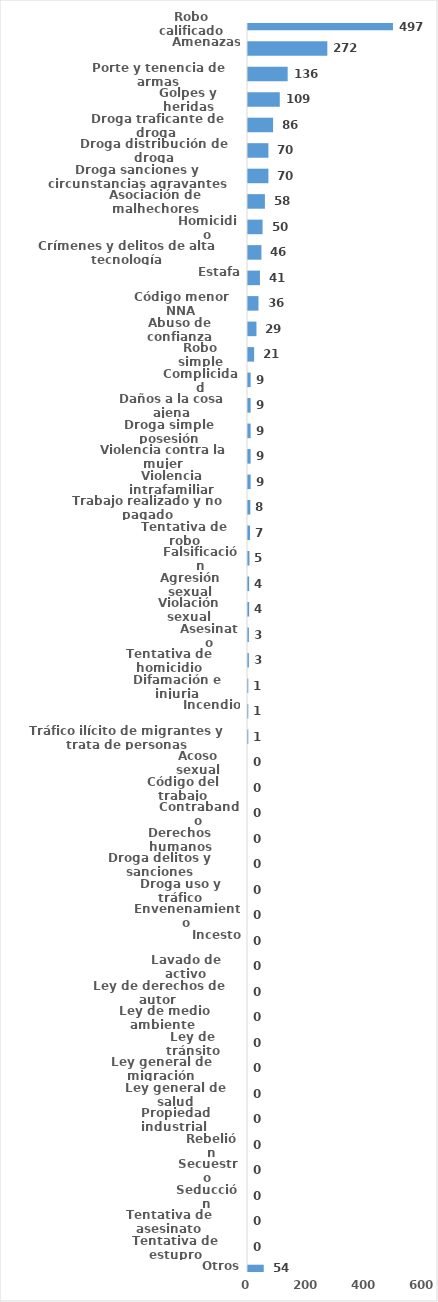
| Category | Series 0 |
|---|---|
| Robo calificado | 497 |
| Amenazas | 272 |
| Porte y tenencia de armas | 136 |
| Golpes y heridas | 109 |
| Droga traficante de droga  | 86 |
| Droga distribución de droga | 70 |
| Droga sanciones y circunstancias agravantes | 70 |
| Asociación de malhechores | 58 |
| Homicidio | 50 |
| Crímenes y delitos de alta tecnología | 46 |
| Estafa | 41 |
| Código menor NNA | 36 |
| Abuso de confianza | 29 |
| Robo simple | 21 |
| Complicidad | 9 |
| Daños a la cosa ajena | 9 |
| Droga simple posesión | 9 |
| Violencia contra la mujer | 9 |
| Violencia intrafamiliar | 9 |
| Trabajo realizado y no pagado | 8 |
| Tentativa de robo | 7 |
| Falsificación | 5 |
| Agresión sexual | 4 |
| Violación sexual | 4 |
| Asesinato | 3 |
| Tentativa de homicidio | 3 |
| Difamación e injuria | 1 |
| Incendio | 1 |
| Tráfico ilícito de migrantes y trata de personas | 1 |
| Acoso sexual | 0 |
| Código del trabajo | 0 |
| Contrabando | 0 |
| Derechos humanos | 0 |
| Droga delitos y sanciones | 0 |
| Droga uso y tráfico | 0 |
| Envenenamiento | 0 |
| Incesto | 0 |
| Lavado de activo | 0 |
| Ley de derechos de autor  | 0 |
| Ley de medio ambiente  | 0 |
| Ley de tránsito | 0 |
| Ley general de migración | 0 |
| Ley general de salud | 0 |
| Propiedad industrial  | 0 |
| Rebelión | 0 |
| Secuestro | 0 |
| Seducción | 0 |
| Tentativa de asesinato | 0 |
| Tentativa de estupro | 0 |
| Otros | 54 |